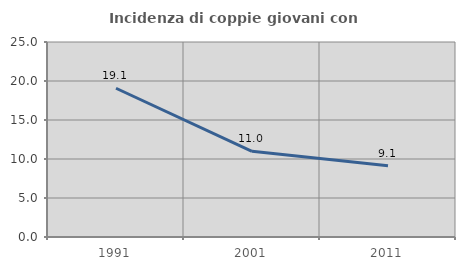
| Category | Incidenza di coppie giovani con figli |
|---|---|
| 1991.0 | 19.072 |
| 2001.0 | 10.989 |
| 2011.0 | 9.143 |